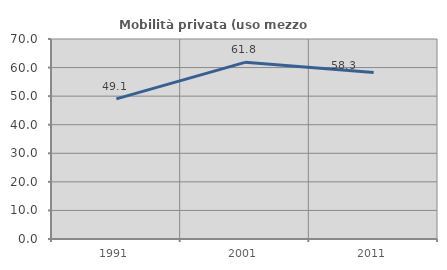
| Category | Mobilità privata (uso mezzo privato) |
|---|---|
| 1991.0 | 49.064 |
| 2001.0 | 61.828 |
| 2011.0 | 58.261 |